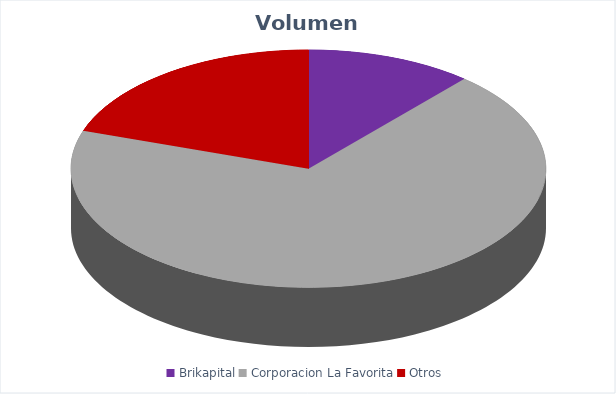
| Category | VOLUMEN ($USD) |
|---|---|
| Brikapital | 10000 |
| Corporacion La Favorita | 60532.8 |
| Otros | 17448.72 |